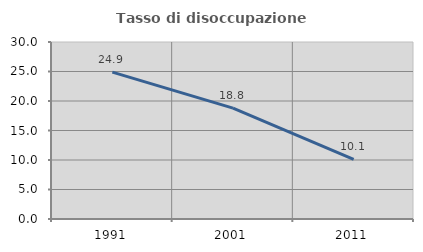
| Category | Tasso di disoccupazione giovanile  |
|---|---|
| 1991.0 | 24.904 |
| 2001.0 | 18.792 |
| 2011.0 | 10.101 |